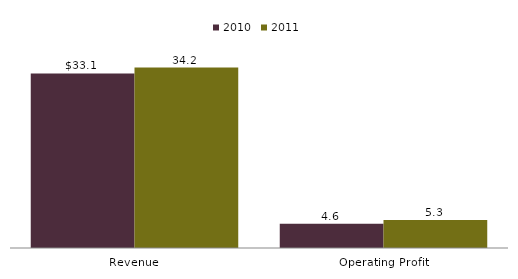
| Category | 2010 | 2011 |
|---|---|---|
| Revenue | 33.1 | 34.2 |
| Operating Profit | 4.6 | 5.3 |